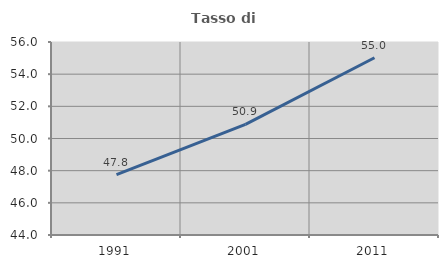
| Category | Tasso di occupazione   |
|---|---|
| 1991.0 | 47.76 |
| 2001.0 | 50.878 |
| 2011.0 | 55.019 |